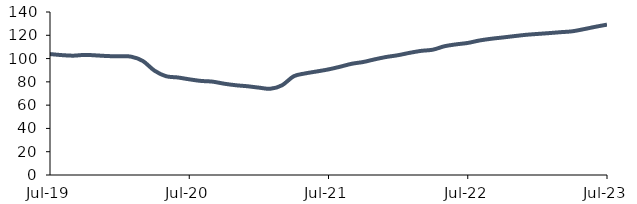
| Category | Series 0 |
|---|---|
| 2019-07-01 | 103.868 |
| 2019-08-01 | 102.983 |
| 2019-09-01 | 102.492 |
| 2019-10-01 | 103.172 |
| 2019-11-01 | 102.703 |
| 2019-12-01 | 102.142 |
| 2020-01-01 | 101.951 |
| 2020-02-01 | 101.62 |
| 2020-03-01 | 97.938 |
| 2020-04-01 | 89.65 |
| 2020-05-01 | 84.839 |
| 2020-06-01 | 83.781 |
| 2020-07-01 | 82.182 |
| 2020-08-01 | 80.808 |
| 2020-09-01 | 80.198 |
| 2020-10-01 | 78.439 |
| 2020-11-01 | 77.102 |
| 2020-12-01 | 76.237 |
| 2021-01-01 | 75.045 |
| 2021-02-01 | 74.096 |
| 2021-03-01 | 77.079 |
| 2021-04-01 | 84.788 |
| 2021-05-01 | 87.267 |
| 2021-06-01 | 88.947 |
| 2021-07-01 | 90.706 |
| 2021-08-01 | 93 |
| 2021-09-01 | 95.533 |
| 2021-10-01 | 97.064 |
| 2021-11-01 | 99.379 |
| 2021-12-01 | 101.416 |
| 2022-01-01 | 102.915 |
| 2022-02-01 | 104.946 |
| 2022-03-01 | 106.628 |
| 2022-04-01 | 107.64 |
| 2022-05-01 | 110.608 |
| 2022-06-01 | 112.203 |
| 2022-07-01 | 113.418 |
| 2022-08-01 | 115.516 |
| 2022-09-01 | 116.992 |
| 2022-10-01 | 118.105 |
| 2022-11-01 | 119.272 |
| 2022-12-01 | 120.383 |
| 2023-01-01 | 121.148 |
| 2023-02-01 | 121.863 |
| 2023-03-01 | 122.663 |
| 2023-04-01 | 123.418 |
| 2023-05-01 | 125.243 |
| 2023-06-01 | 127.292 |
| 2023-07-01 | 129.14 |